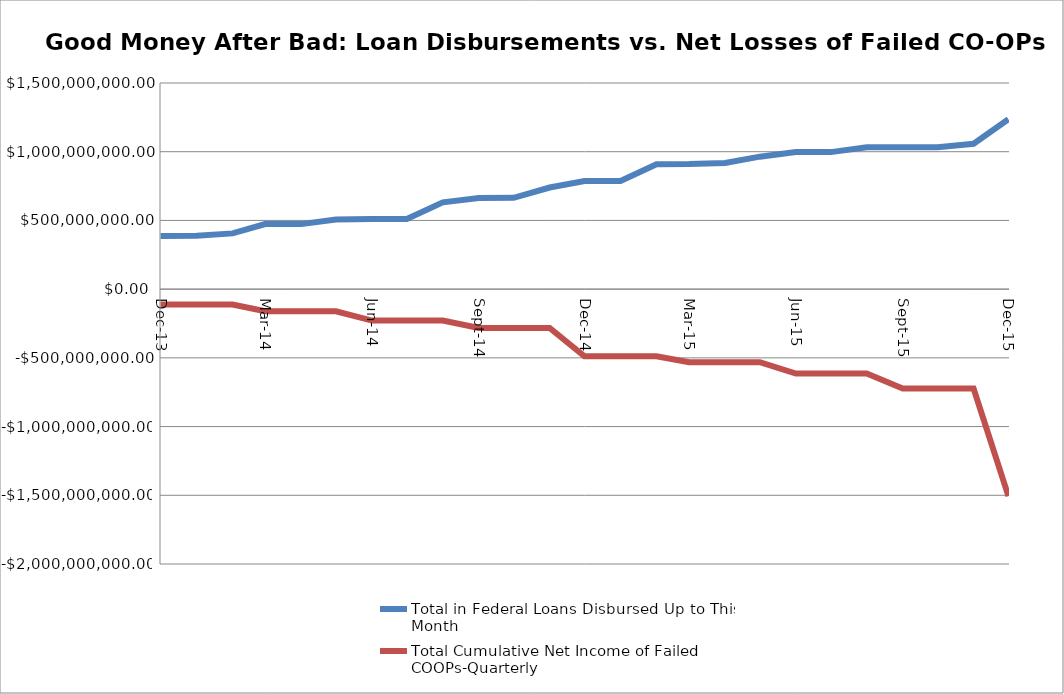
| Category | Total in Federal Loans Disbursed Up to This Month  | Total Cumulative Net Income of Failed COOPs-Quarterly  |
|---|---|---|
| 2013-12-01 | 387452796 | -111671666 |
| 2014-01-01 | 388563801 | -111671666 |
| 2014-02-01 | 405739708 | -111671666 |
| 2014-03-01 | 473214469 | -161272856 |
| 2014-04-01 | 473239469 | -161272856 |
| 2014-05-01 | 507338284 | -161272856 |
| 2014-06-01 | 509748962 | -228787187 |
| 2014-07-01 | 509748962 | -228787187 |
| 2014-08-01 | 631584843 | -228787187 |
| 2014-09-01 | 663770126 | -282256943 |
| 2014-10-01 | 664137826 | -282256943 |
| 2014-11-01 | 739605625 | -282256943 |
| 2014-12-01 | 786723461 | -488327293 |
| 2015-01-01 | 786856461 | -488327293 |
| 2015-02-01 | 909363555 | -488327293 |
| 2015-03-01 | 910041955 | -531786265 |
| 2015-04-01 | 918420565 | -531786265 |
| 2015-05-01 | 963961711 | -531786265 |
| 2015-06-01 | 997067963 | -614053397 |
| 2015-07-01 | 997067963 | -614053397 |
| 2015-08-01 | 1032541175 | -614053397 |
| 2015-09-01 | 1032861175 | -723111187 |
| 2015-10-01 | 1032861175 | -723111187 |
| 2015-11-01 | 1057737685 | -723111187 |
| 2015-12-01 | 1235764957 | -1505838175 |